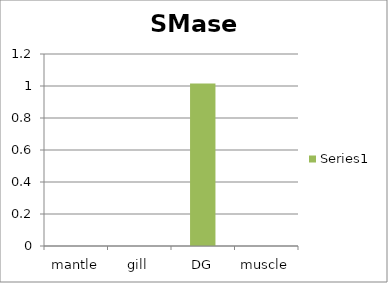
| Category | Series 0 |
|---|---|
| mantle | 0 |
| gill | 0 |
| DG | 1.016 |
| muscle | 0 |